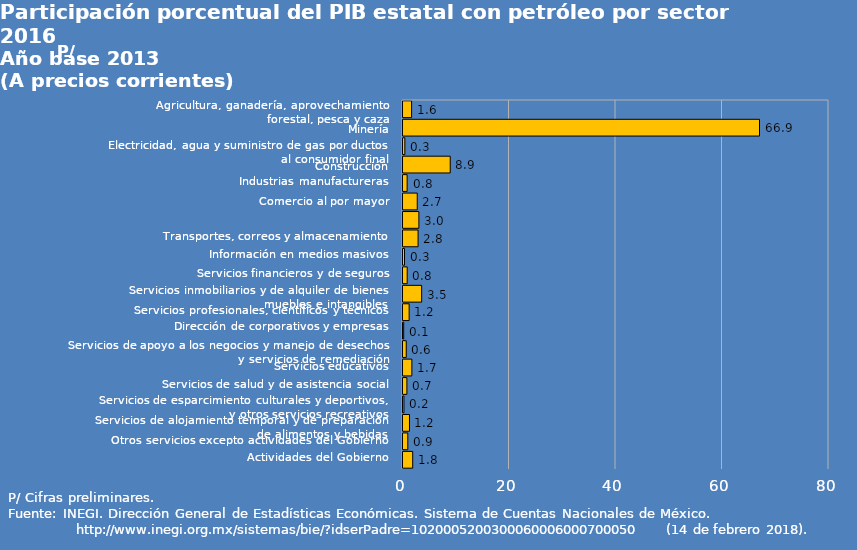
| Category | Campeche |
|---|---|
| Agricultura, ganadería, aprovechamiento forestal, pesca y caza | 1.612 |
| Minería | 66.948 |
| Electricidad, agua y suministro de gas por ductos al consumidor final | 0.344 |
| Construcción | 8.869 |
| Industrias manufactureras | 0.777 |
| Comercio al por mayor | 2.673 |
| Comercio al por menor | 2.982 |
| Transportes, correos y almacenamiento | 2.83 |
| Información en medios masivos | 0.282 |
| Servicios financieros y de seguros | 0.789 |
| Servicios inmobiliarios y de alquiler de bienes muebles e intangibles | 3.503 |
| Servicios profesionales, científicos y técnicos | 1.151 |
| Dirección de corporativos y empresas | 0.127 |
| Servicios de apoyo a los negocios y manejo de desechos y servicios de remediación | 0.607 |
| Servicios educativos | 1.662 |
| Servicios de salud y de asistencia social | 0.73 |
| Servicios de esparcimiento culturales y deportivos, y otros servicios recreativos | 0.174 |
| Servicios de alojamiento temporal y de preparación de alimentos y bebidas | 1.215 |
| Otros servicios excepto actividades del Gobierno | 0.902 |
| Actividades del Gobierno | 1.821 |